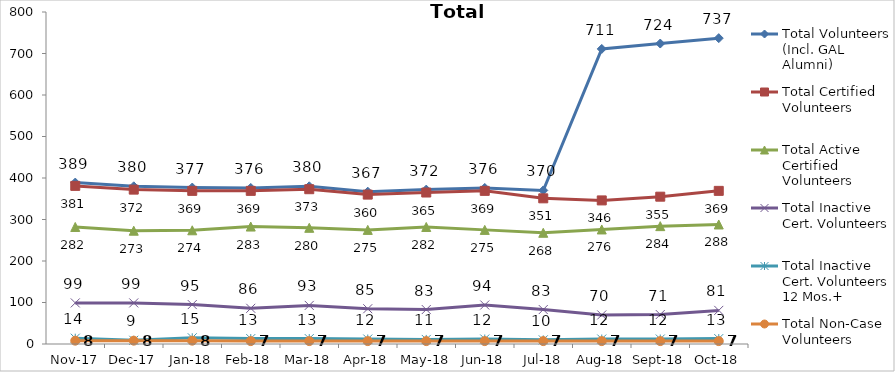
| Category | Total Volunteers (Incl. GAL Alumni) | Total Certified Volunteers | Total Active Certified Volunteers | Total Inactive Cert. Volunteers | Total Inactive Cert. Volunteers 12 Mos.+ | Total Non-Case Volunteers |
|---|---|---|---|---|---|---|
| 2017-11-01 | 389 | 381 | 282 | 99 | 14 | 8 |
| 2017-12-01 | 380 | 372 | 273 | 99 | 9 | 8 |
| 2018-01-01 | 377 | 369 | 274 | 95 | 15 | 8 |
| 2018-02-01 | 376 | 369 | 283 | 86 | 13 | 7 |
| 2018-03-01 | 380 | 373 | 280 | 93 | 13 | 7 |
| 2018-04-01 | 367 | 360 | 275 | 85 | 12 | 7 |
| 2018-05-01 | 372 | 365 | 282 | 83 | 11 | 7 |
| 2018-06-01 | 376 | 369 | 275 | 94 | 12 | 7 |
| 2018-07-01 | 370 | 351 | 268 | 83 | 10 | 7 |
| 2018-08-01 | 711 | 346 | 276 | 70 | 12 | 7 |
| 2018-09-01 | 724 | 355 | 284 | 71 | 12 | 7 |
| 2018-10-01 | 737 | 369 | 288 | 81 | 13 | 7 |